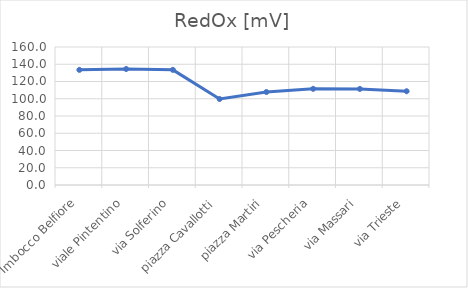
| Category | RedOx [mV] |
|---|---|
| Imbocco Belfiore | 133.5 |
| viale Pintentino | 134.5 |
| via Solferino | 133.5 |
| piazza Cavallotti | 99.7 |
| piazza Martiri | 107.8 |
| via Pescheria | 111.5 |
| via Massari | 111.4 |
| via Trieste | 108.7 |